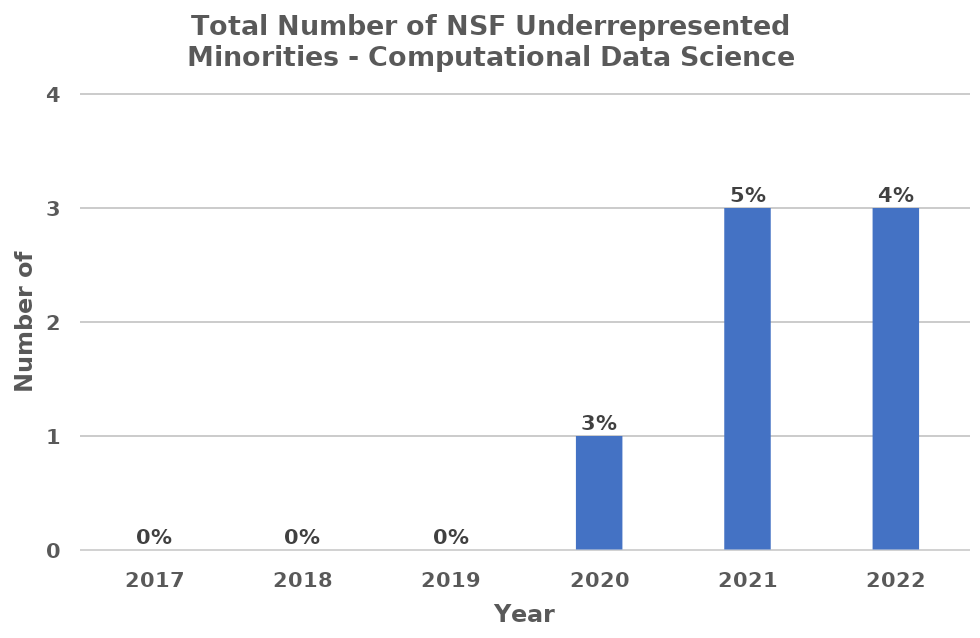
| Category | Total Number of NSF Underrepresented Computational Data Science Students |
|---|---|
| 2017.0 | 0 |
| 2018.0 | 0 |
| 2019.0 | 0 |
| 2020.0 | 1 |
| 2021.0 | 3 |
| 2022.0 | 3 |